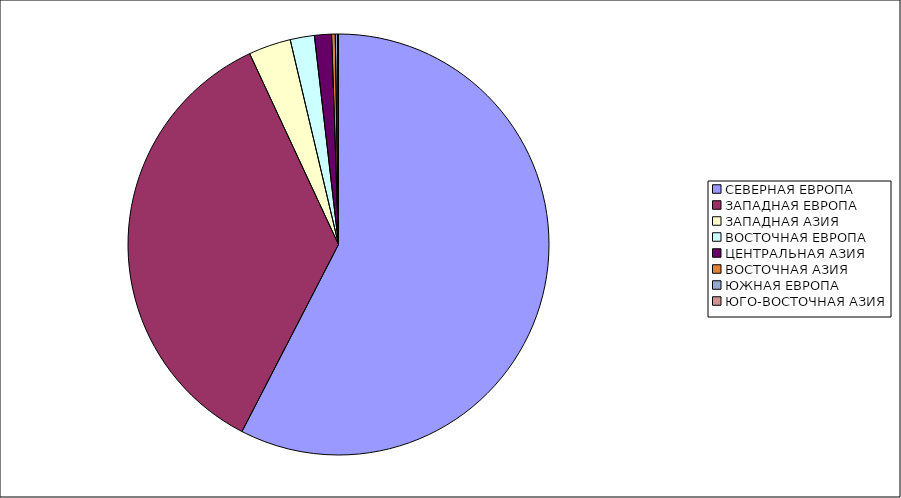
| Category | Оборот |
|---|---|
| СЕВЕРНАЯ ЕВРОПА | 57.583 |
| ЗАПАДНАЯ ЕВРОПА | 35.482 |
| ЗАПАДНАЯ АЗИЯ | 3.246 |
| ВОСТОЧНАЯ ЕВРОПА | 1.857 |
| ЦЕНТРАЛЬНАЯ АЗИЯ | 1.31 |
| ВОСТОЧНАЯ АЗИЯ | 0.276 |
| ЮЖНАЯ ЕВРОПА | 0.176 |
| ЮГО-ВОСТОЧНАЯ АЗИЯ | 0.07 |